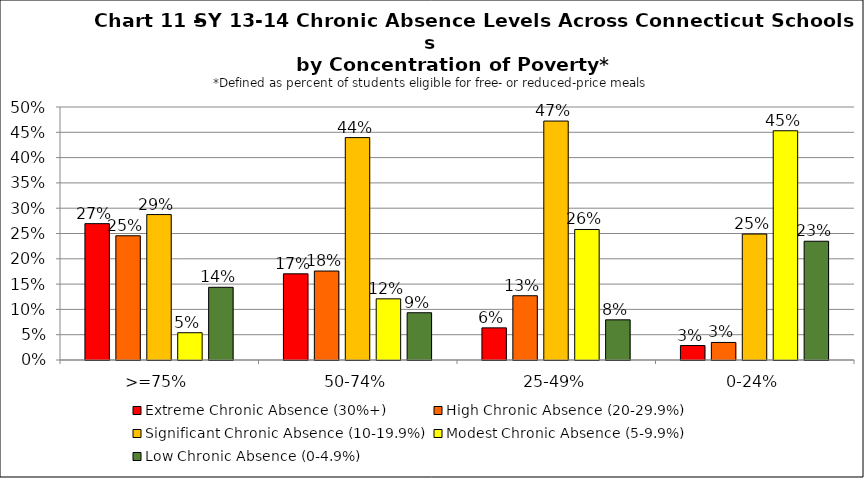
| Category | Extreme Chronic Absence (30%+) | High Chronic Absence (20-29.9%) | Significant Chronic Absence (10-19.9%) | Modest Chronic Absence (5-9.9%) | Low Chronic Absence (0-4.9%) |
|---|---|---|---|---|---|
| 0 | 0.269 | 0.246 | 0.287 | 0.054 | 0.144 |
| 1 | 0.17 | 0.176 | 0.44 | 0.121 | 0.093 |
| 2 | 0.063 | 0.127 | 0.472 | 0.258 | 0.079 |
| 3 | 0.029 | 0.035 | 0.249 | 0.453 | 0.235 |